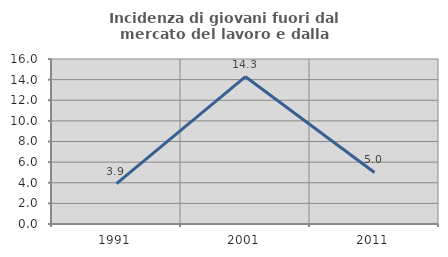
| Category | Incidenza di giovani fuori dal mercato del lavoro e dalla formazione  |
|---|---|
| 1991.0 | 3.922 |
| 2001.0 | 14.286 |
| 2011.0 | 5 |